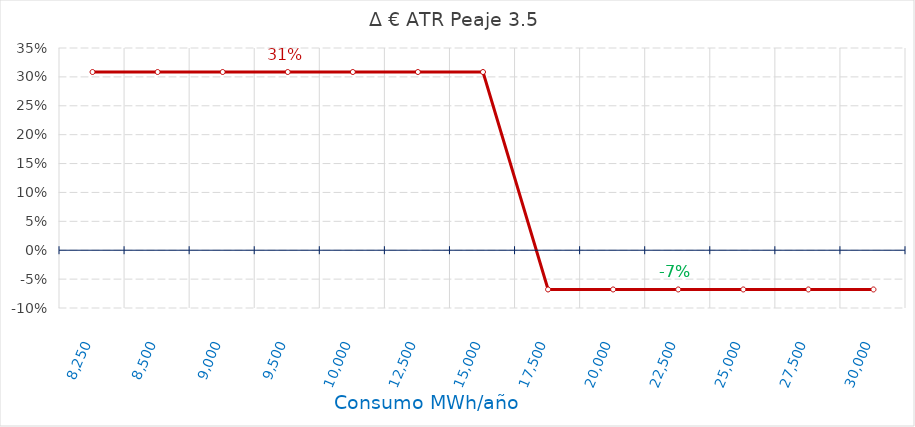
| Category | D €/año |
|---|---|
| 8250.0 | 0.308 |
| 8500.0 | 0.308 |
| 9000.0 | 0.308 |
| 9500.0 | 0.308 |
| 10000.0 | 0.308 |
| 12500.0 | 0.308 |
| 15000.0 | 0.308 |
| 17500.0 | -0.068 |
| 20000.0 | -0.068 |
| 22500.0 | -0.068 |
| 25000.0 | -0.068 |
| 27500.0 | -0.068 |
| 30000.0 | -0.068 |